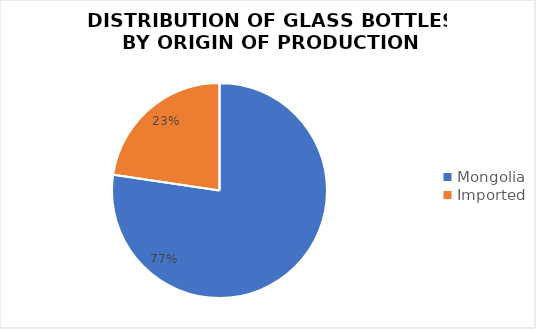
| Category | Series 0 |
|---|---|
| Mongolia | 2394 |
| Imported | 701 |